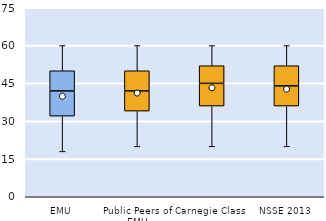
| Category | 25th | 50th | 75th |
|---|---|---|---|
| EMU | 32 | 10 | 8 |
| Public Peers of EMU | 34 | 8 | 8 |
| Carnegie Class | 36 | 9 | 7 |
| NSSE 2013 | 36 | 8 | 8 |